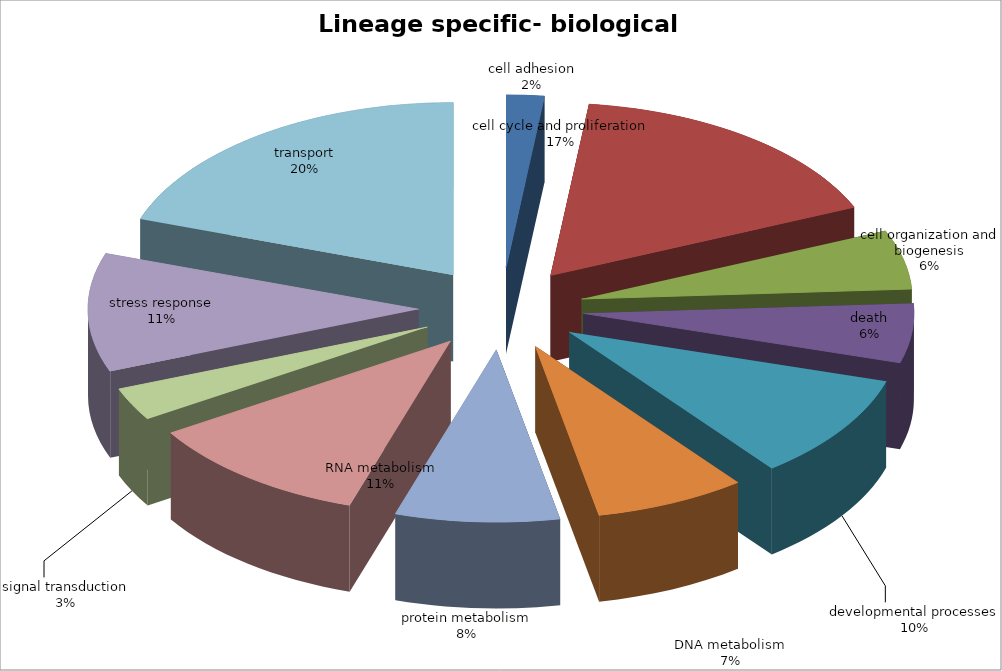
| Category | Series 0 |
|---|---|
| cell adhesion | 3 |
| cell cycle and proliferation | 27 |
| cell organization and biogenesis | 9 |
| death | 9 |
| developmental processes | 16 |
| DNA metabolism | 12 |
| protein metabolism | 13 |
| RNA metabolism | 18 |
| signal transduction | 5 |
| stress response | 18 |
| transport | 32 |